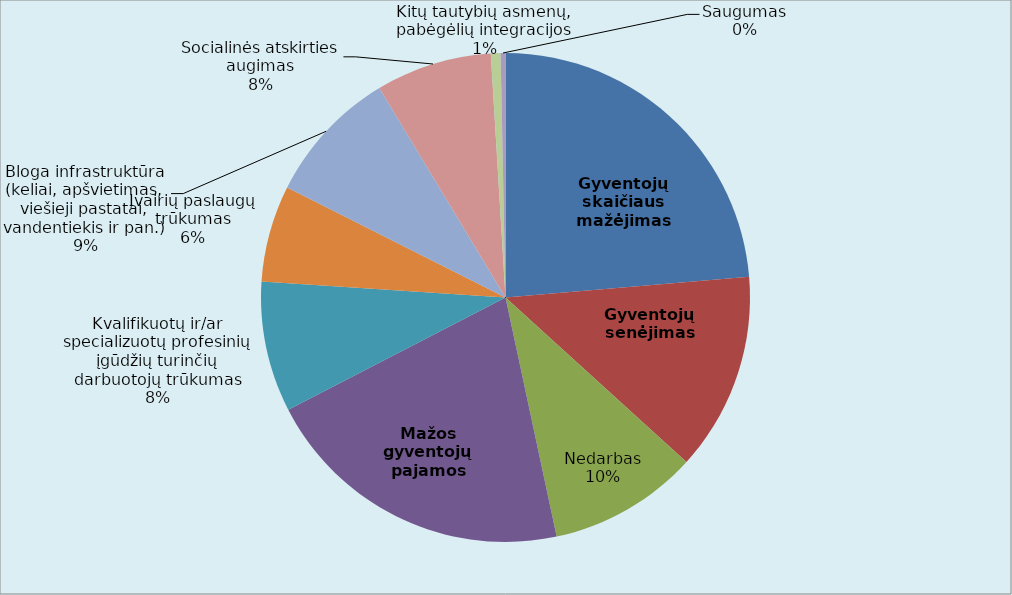
| Category | Series 0 |
|---|---|
| Gyventojų skaičiaus mažėjimas | 74 |
| Gyventojų senėjimas | 41 |
| Nedarbas | 31 |
| Mažos gyventojų pajamos | 65 |
| Kvalifikuotų ir/ar specializuotų profesinių įgūdžių turinčių darbuotojų trūkumas | 27 |
| Įvairių paslaugų trūkumas | 20 |
| Bloga infrastruktūra (keliai, apšvietimas, viešieji pastatai, vandentiekis ir pan.) | 28 |
| Socialinės atskirties augimas | 24 |
| Kitų tautybių asmenų, pabėgėlių integracijos | 2 |
| Saugumas | 1 |